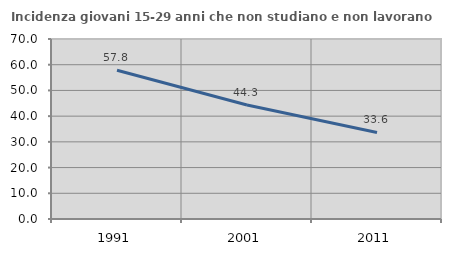
| Category | Incidenza giovani 15-29 anni che non studiano e non lavorano  |
|---|---|
| 1991.0 | 57.823 |
| 2001.0 | 44.326 |
| 2011.0 | 33.639 |